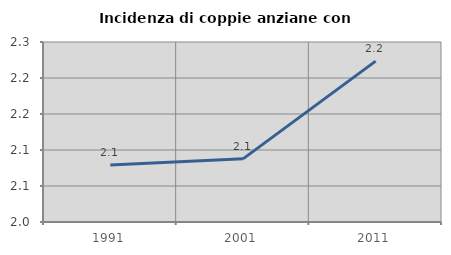
| Category | Incidenza di coppie anziane con figli |
|---|---|
| 1991.0 | 2.079 |
| 2001.0 | 2.088 |
| 2011.0 | 2.223 |